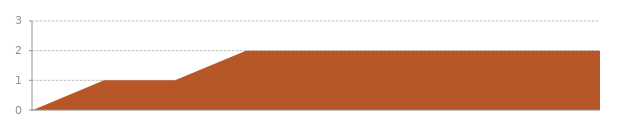
| Category | Series 0 |
|---|---|
| 0 | 0 |
| 1 | 1 |
| 2 | 1 |
| 3 | 2 |
| 4 | 2 |
| 5 | 2 |
| 6 | 2 |
| 7 | 2 |
| 8 | 2 |